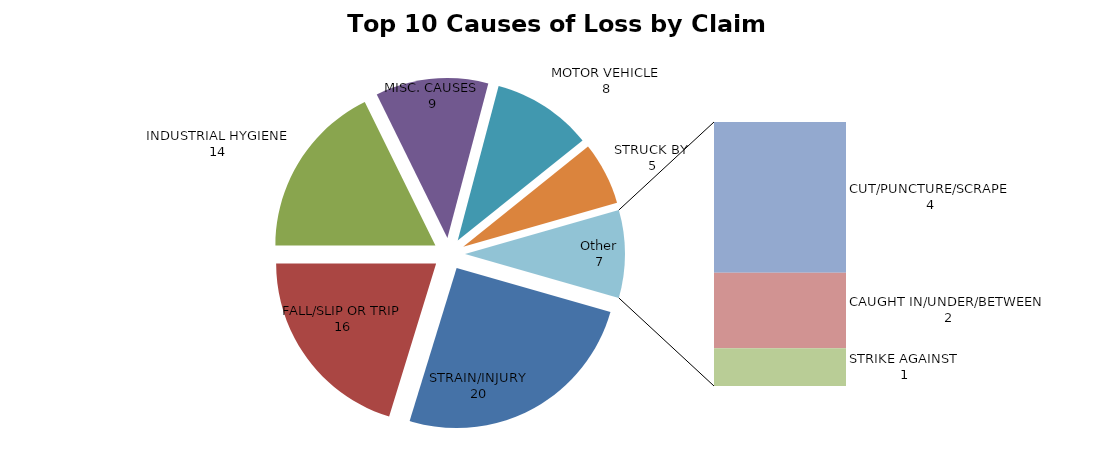
| Category |  20  |
|---|---|
| STRAIN/INJURY | 20 |
| FALL/SLIP OR TRIP | 16 |
| INDUSTRIAL HYGIENE | 14 |
| MISC. CAUSES | 9 |
| MOTOR VEHICLE | 8 |
| STRUCK BY | 5 |
| CUT/PUNCTURE/SCRAPE | 4 |
| CAUGHT IN/UNDER/BETWEEN | 2 |
| STRIKE AGAINST | 1 |